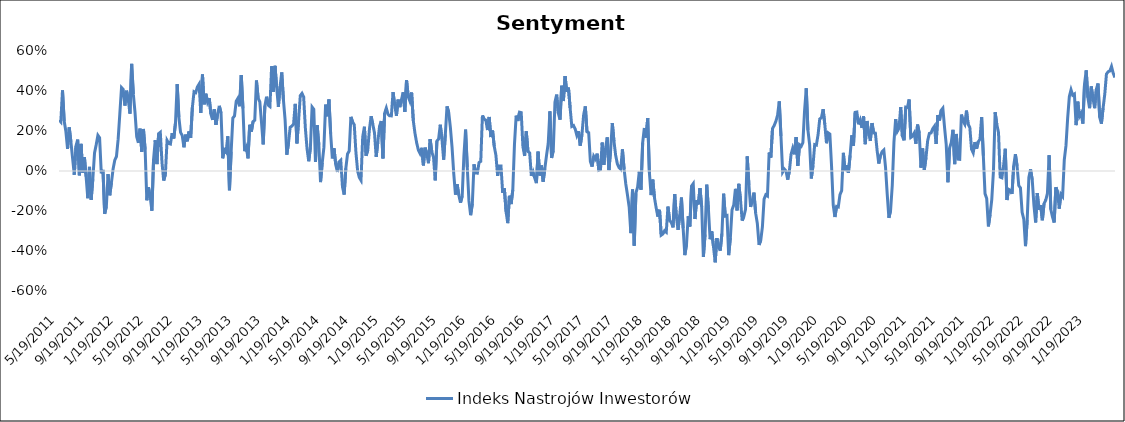
| Category | Indeks Nastrojów Inwestorów |
|---|---|
| 5/19/11 | 0.255 |
| 5/26/11 | 0.245 |
| 6/2/11 | 0.403 |
| 6/9/11 | 0.25 |
| 6/16/11 | 0.199 |
| 6/23/11 | 0.11 |
| 6/30/11 | 0.218 |
| 7/7/11 | 0.145 |
| 7/14/11 | 0.063 |
| 7/21/11 | -0.019 |
| 7/28/11 | 0.125 |
| 8/4/11 | 0.157 |
| 8/11/11 | -0.022 |
| 8/18/11 | 0.136 |
| 8/25/11 | -0.008 |
| 9/1/11 | 0.07 |
| 9/8/11 | -0.028 |
| 9/15/11 | -0.136 |
| 9/22/11 | 0.02 |
| 9/29/11 | -0.144 |
| 10/6/11 | -0.038 |
| 10/13/11 | 0.09 |
| 10/20/11 | 0.132 |
| 10/27/11 | 0.179 |
| 11/3/11 | 0.167 |
| 11/10/11 | -0.012 |
| 11/17/11 | 0.005 |
| 11/24/11 | -0.214 |
| 12/1/11 | -0.177 |
| 12/8/11 | -0.016 |
| 12/15/11 | -0.121 |
| 12/22/11 | -0.06 |
| 12/29/11 | 0.01 |
| 1/5/12 | 0.054 |
| 1/12/12 | 0.073 |
| 1/19/12 | 0.159 |
| 1/26/12 | 0.287 |
| 2/2/12 | 0.417 |
| 2/9/12 | 0.408 |
| 2/16/12 | 0.327 |
| 2/23/12 | 0.402 |
| 3/1/12 | 0.357 |
| 3/8/12 | 0.287 |
| 3/15/12 | 0.536 |
| 3/22/12 | 0.384 |
| 3/29/12 | 0.294 |
| 4/5/12 | 0.172 |
| 4/12/12 | 0.141 |
| 4/19/12 | 0.212 |
| 4/26/12 | 0.096 |
| 5/3/12 | 0.21 |
| 5/10/12 | 0.107 |
| 5/17/12 | -0.146 |
| 5/24/12 | -0.081 |
| 5/31/12 | -0.128 |
| 6/7/12 | -0.198 |
| 6/14/12 | 0.058 |
| 6/21/12 | 0.154 |
| 6/28/12 | 0.034 |
| 7/5/12 | 0.187 |
| 7/12/12 | 0.193 |
| 7/19/12 | 0.042 |
| 7/26/12 | -0.048 |
| 8/2/12 | -0.017 |
| 8/9/12 | 0.153 |
| 8/16/12 | 0.138 |
| 8/23/12 | 0.135 |
| 8/30/12 | 0.189 |
| 9/6/12 | 0.163 |
| 9/13/12 | 0.241 |
| 9/20/12 | 0.434 |
| 9/27/12 | 0.27 |
| 10/4/12 | 0.193 |
| 10/11/12 | 0.177 |
| 10/18/12 | 0.119 |
| 10/25/12 | 0.182 |
| 11/1/12 | 0.148 |
| 11/8/12 | 0.198 |
| 11/15/12 | 0.166 |
| 11/22/12 | 0.317 |
| 11/29/12 | 0.396 |
| 12/6/12 | 0.392 |
| 12/13/12 | 0.421 |
| 12/20/12 | 0.435 |
| 12/27/12 | 0.29 |
| 1/3/13 | 0.482 |
| 1/10/13 | 0.333 |
| 1/17/13 | 0.386 |
| 1/24/13 | 0.344 |
| 1/31/13 | 0.365 |
| 2/7/13 | 0.285 |
| 2/14/13 | 0.256 |
| 2/21/13 | 0.308 |
| 2/28/13 | 0.231 |
| 3/7/13 | 0.285 |
| 3/14/13 | 0.326 |
| 3/21/13 | 0.29 |
| 3/28/13 | 0.063 |
| 4/4/13 | 0.105 |
| 4/11/13 | 0.094 |
| 4/18/13 | 0.174 |
| 4/25/13 | -0.096 |
| 5/2/13 | 0.097 |
| 5/9/13 | 0.264 |
| 5/16/13 | 0.276 |
| 5/23/13 | 0.349 |
| 5/30/13 | 0.364 |
| 6/6/13 | 0.324 |
| 6/13/13 | 0.48 |
| 6/20/13 | 0.313 |
| 6/27/13 | 0.099 |
| 7/4/13 | 0.118 |
| 7/11/13 | 0.063 |
| 7/18/13 | 0.231 |
| 7/25/13 | 0.197 |
| 8/1/13 | 0.247 |
| 8/8/13 | 0.254 |
| 8/15/13 | 0.453 |
| 8/22/13 | 0.364 |
| 8/29/13 | 0.346 |
| 9/5/13 | 0.243 |
| 9/12/13 | 0.133 |
| 9/19/13 | 0.326 |
| 9/26/13 | 0.371 |
| 10/3/13 | 0.329 |
| 10/10/13 | 0.322 |
| 10/17/13 | 0.523 |
| 10/24/13 | 0.396 |
| 10/31/13 | 0.526 |
| 11/7/13 | 0.418 |
| 11/14/13 | 0.321 |
| 11/21/13 | 0.422 |
| 11/28/13 | 0.493 |
| 12/5/13 | 0.355 |
| 12/12/13 | 0.255 |
| 12/19/13 | 0.081 |
| 12/26/13 | 0.14 |
| 1/2/14 | 0.219 |
| 1/9/14 | 0.224 |
| 1/16/14 | 0.234 |
| 1/23/14 | 0.336 |
| 1/30/14 | 0.138 |
| 2/6/14 | 0.253 |
| 2/13/14 | 0.377 |
| 2/20/14 | 0.388 |
| 2/27/14 | 0.37 |
| 3/6/14 | 0.215 |
| 3/13/14 | 0.112 |
| 3/20/14 | 0.049 |
| 3/27/14 | 0.118 |
| 4/3/14 | 0.32 |
| 4/10/14 | 0.309 |
| 4/17/14 | 0.045 |
| 4/24/14 | 0.229 |
| 5/1/14 | 0.131 |
| 5/8/14 | -0.055 |
| 5/15/14 | 0.04 |
| 5/22/14 | 0.118 |
| 5/29/14 | 0.332 |
| 6/5/14 | 0.273 |
| 6/12/14 | 0.358 |
| 6/19/14 | 0.186 |
| 6/26/14 | 0.063 |
| 7/3/14 | 0.114 |
| 7/10/14 | 0.033 |
| 7/17/14 | -0.005 |
| 7/24/14 | 0.046 |
| 7/31/14 | 0.054 |
| 8/7/14 | -0.079 |
| 8/14/14 | -0.118 |
| 8/21/14 | 0.013 |
| 8/28/14 | 0.085 |
| 9/4/14 | 0.1 |
| 9/11/14 | 0.271 |
| 9/18/14 | 0.245 |
| 9/25/14 | 0.231 |
| 10/2/14 | 0.092 |
| 10/9/14 | 0 |
| 10/16/14 | -0.033 |
| 10/23/14 | -0.047 |
| 10/30/14 | 0.169 |
| 11/6/14 | 0.221 |
| 11/13/14 | 0.076 |
| 11/20/14 | 0.104 |
| 11/27/14 | 0.209 |
| 12/4/14 | 0.274 |
| 12/11/14 | 0.233 |
| 12/18/14 | 0.19 |
| 12/25/14 | 0.07 |
| 1/1/15 | 0.147 |
| 1/8/15 | 0.224 |
| 1/15/15 | 0.25 |
| 1/22/15 | 0.063 |
| 1/29/15 | 0.289 |
| 2/5/15 | 0.315 |
| 2/12/15 | 0.284 |
| 2/19/15 | 0.276 |
| 2/26/15 | 0.276 |
| 3/5/15 | 0.394 |
| 3/12/15 | 0.329 |
| 3/19/15 | 0.276 |
| 3/26/15 | 0.357 |
| 4/2/15 | 0.319 |
| 4/9/15 | 0.357 |
| 4/16/15 | 0.394 |
| 4/23/15 | 0.295 |
| 4/30/15 | 0.454 |
| 5/7/15 | 0.372 |
| 5/14/15 | 0.349 |
| 5/21/15 | 0.393 |
| 5/28/15 | 0.252 |
| 6/4/15 | 0.188 |
| 6/11/15 | 0.141 |
| 6/18/15 | 0.105 |
| 6/25/15 | 0.088 |
| 7/2/15 | 0.116 |
| 7/9/15 | 0.028 |
| 7/16/15 | 0.117 |
| 7/23/15 | 0.087 |
| 7/30/15 | 0.039 |
| 8/6/15 | 0.159 |
| 8/13/15 | 0.095 |
| 8/20/15 | 0.068 |
| 8/27/15 | -0.047 |
| 9/3/15 | 0.15 |
| 9/10/15 | 0.16 |
| 9/17/15 | 0.231 |
| 9/24/15 | 0.159 |
| 10/1/15 | 0.057 |
| 10/8/15 | 0.183 |
| 10/15/15 | 0.323 |
| 10/22/15 | 0.294 |
| 10/29/15 | 0.217 |
| 11/5/15 | 0.116 |
| 11/12/15 | -0.015 |
| 11/19/15 | -0.118 |
| 11/26/15 | -0.066 |
| 12/3/15 | -0.12 |
| 12/10/15 | -0.159 |
| 12/17/15 | -0.125 |
| 12/24/15 | 0.074 |
| 12/31/15 | 0.207 |
| 1/7/16 | 0.02 |
| 1/14/16 | -0.149 |
| 1/21/16 | -0.221 |
| 1/28/16 | -0.164 |
| 2/4/16 | 0.033 |
| 2/11/16 | -0.01 |
| 2/18/16 | -0.011 |
| 2/25/16 | 0.043 |
| 3/3/16 | 0.048 |
| 3/10/16 | 0.278 |
| 3/17/16 | 0.259 |
| 3/24/16 | 0.255 |
| 3/31/16 | 0.205 |
| 4/7/16 | 0.27 |
| 4/14/16 | 0.17 |
| 4/21/16 | 0.203 |
| 4/28/16 | 0.124 |
| 5/5/16 | 0.078 |
| 5/12/16 | -0.024 |
| 5/19/16 | 0.025 |
| 5/26/16 | 0.025 |
| 6/2/16 | -0.109 |
| 6/9/16 | -0.087 |
| 6/16/16 | -0.202 |
| 6/23/16 | -0.261 |
| 6/30/16 | -0.124 |
| 7/7/16 | -0.165 |
| 7/14/16 | -0.094 |
| 7/21/16 | 0.135 |
| 7/28/16 | 0.277 |
| 8/4/16 | 0.25 |
| 8/11/16 | 0.294 |
| 8/18/16 | 0.292 |
| 8/25/16 | 0.122 |
| 9/1/16 | 0.075 |
| 9/8/16 | 0.198 |
| 9/15/16 | 0.098 |
| 9/22/16 | 0.09 |
| 9/29/16 | -0.024 |
| 10/6/16 | -0.004 |
| 10/13/16 | -0.035 |
| 10/20/16 | -0.06 |
| 10/27/16 | 0.097 |
| 11/3/16 | -0.023 |
| 11/10/16 | 0.028 |
| 11/17/16 | -0.054 |
| 11/24/16 | 0.013 |
| 12/1/16 | 0.078 |
| 12/8/16 | 0.137 |
| 12/15/16 | 0.298 |
| 12/22/16 | 0.065 |
| 12/29/16 | 0.102 |
| 1/5/17 | 0.344 |
| 1/12/17 | 0.382 |
| 1/19/17 | 0.289 |
| 1/26/17 | 0.257 |
| 2/2/17 | 0.426 |
| 2/9/17 | 0.35 |
| 2/16/17 | 0.475 |
| 2/23/17 | 0.396 |
| 3/2/17 | 0.417 |
| 3/9/17 | 0.315 |
| 3/16/17 | 0.223 |
| 3/23/17 | 0.228 |
| 3/30/17 | 0.21 |
| 4/6/17 | 0.178 |
| 4/13/17 | 0.199 |
| 4/20/17 | 0.127 |
| 4/27/17 | 0.182 |
| 5/4/17 | 0.28 |
| 5/11/17 | 0.323 |
| 5/18/17 | 0.196 |
| 5/25/17 | 0.191 |
| 6/1/17 | 0.047 |
| 6/8/17 | 0.022 |
| 6/15/17 | 0.074 |
| 6/22/17 | 0.06 |
| 6/29/17 | 0.087 |
| 7/6/17 | 0.004 |
| 7/13/17 | 0.007 |
| 7/20/17 | 0.142 |
| 7/27/17 | 0.031 |
| 8/3/17 | 0.114 |
| 8/10/17 | 0.168 |
| 8/17/17 | 0.005 |
| 8/24/17 | 0.102 |
| 8/31/17 | 0.24 |
| 9/7/17 | 0.148 |
| 9/14/17 | 0.078 |
| 9/21/17 | 0.036 |
| 9/28/17 | 0.017 |
| 10/5/17 | 0.008 |
| 10/12/17 | 0.108 |
| 10/19/17 | 0.009 |
| 10/26/17 | -0.065 |
| 11/2/17 | -0.12 |
| 11/9/17 | -0.18 |
| 11/16/17 | -0.311 |
| 11/23/17 | -0.093 |
| 11/30/17 | -0.373 |
| 12/7/17 | -0.11 |
| 12/14/17 | -0.081 |
| 12/21/17 | -0.004 |
| 12/28/17 | -0.093 |
| 1/4/18 | 0.141 |
| 1/11/18 | 0.215 |
| 1/18/18 | 0.167 |
| 1/25/18 | 0.264 |
| 2/1/18 | -0.009 |
| 2/8/18 | -0.12 |
| 2/15/18 | -0.043 |
| 2/22/18 | -0.133 |
| 3/1/18 | -0.184 |
| 3/8/18 | -0.228 |
| 3/15/18 | -0.194 |
| 3/22/18 | -0.321 |
| 3/29/18 | -0.315 |
| 4/5/18 | -0.299 |
| 4/12/18 | -0.306 |
| 4/19/18 | -0.178 |
| 4/26/18 | -0.248 |
| 5/3/18 | -0.258 |
| 5/10/18 | -0.282 |
| 5/17/18 | -0.116 |
| 5/24/18 | -0.23 |
| 5/31/18 | -0.295 |
| 6/7/18 | -0.22 |
| 6/14/18 | -0.133 |
| 6/21/18 | -0.286 |
| 6/28/18 | -0.421 |
| 7/5/18 | -0.368 |
| 7/12/18 | -0.226 |
| 7/19/18 | -0.278 |
| 7/26/18 | -0.075 |
| 8/2/18 | -0.063 |
| 8/9/18 | -0.24 |
| 8/16/18 | -0.147 |
| 8/23/18 | -0.167 |
| 8/30/18 | -0.086 |
| 9/6/18 | -0.178 |
| 9/13/18 | -0.43 |
| 9/20/18 | -0.317 |
| 9/27/18 | -0.068 |
| 10/4/18 | -0.192 |
| 10/11/18 | -0.341 |
| 10/18/18 | -0.302 |
| 10/25/18 | -0.379 |
| 11/1/18 | -0.457 |
| 11/8/18 | -0.336 |
| 11/15/18 | -0.378 |
| 11/22/18 | -0.398 |
| 11/29/18 | -0.313 |
| 12/6/18 | -0.113 |
| 12/13/18 | -0.225 |
| 12/20/18 | -0.223 |
| 12/27/18 | -0.421 |
| 1/3/19 | -0.335 |
| 1/10/19 | -0.194 |
| 1/17/19 | -0.17 |
| 1/24/19 | -0.089 |
| 1/31/19 | -0.197 |
| 2/7/19 | -0.064 |
| 2/14/19 | -0.142 |
| 2/21/19 | -0.248 |
| 2/28/19 | -0.228 |
| 3/7/19 | -0.191 |
| 3/14/19 | 0.073 |
| 3/21/19 | -0.069 |
| 3/28/19 | -0.18 |
| 4/4/19 | -0.147 |
| 4/11/19 | -0.108 |
| 4/18/19 | -0.211 |
| 4/25/19 | -0.263 |
| 5/2/19 | -0.369 |
| 5/9/19 | -0.348 |
| 5/16/19 | -0.28 |
| 5/23/19 | -0.141 |
| 5/30/19 | -0.119 |
| 6/6/19 | -0.125 |
| 6/13/19 | 0.092 |
| 6/20/19 | 0.067 |
| 6/27/19 | 0.212 |
| 7/4/19 | 0.228 |
| 7/11/19 | 0.249 |
| 7/18/19 | 0.279 |
| 7/25/19 | 0.348 |
| 8/1/19 | 0.175 |
| 8/8/19 | -0.005 |
| 8/15/19 | 0.009 |
| 8/22/19 | 0 |
| 8/29/19 | -0.043 |
| 9/5/19 | 0 |
| 9/12/19 | 0.083 |
| 9/19/19 | 0.114 |
| 9/26/19 | 0.083 |
| 10/3/19 | 0.169 |
| 10/10/19 | 0.026 |
| 10/17/19 | 0.131 |
| 10/24/19 | 0.124 |
| 10/31/19 | 0.142 |
| 11/7/19 | 0.301 |
| 11/14/19 | 0.414 |
| 11/21/19 | 0.205 |
| 11/28/19 | 0.132 |
| 12/5/19 | -0.037 |
| 12/12/19 | 0.027 |
| 12/19/19 | 0.132 |
| 12/26/19 | 0.129 |
| 1/2/20 | 0.181 |
| 1/9/20 | 0.26 |
| 1/16/20 | 0.266 |
| 1/23/20 | 0.309 |
| 1/30/20 | 0.234 |
| 2/6/20 | 0.139 |
| 2/13/20 | 0.191 |
| 2/20/20 | 0.185 |
| 2/27/20 | 0.026 |
| 3/5/20 | -0.17 |
| 3/12/20 | -0.23 |
| 3/19/20 | -0.177 |
| 3/26/20 | -0.18 |
| 4/2/20 | -0.118 |
| 4/9/20 | -0.098 |
| 4/16/20 | 0.091 |
| 4/23/20 | 0 |
| 4/30/20 | 0.029 |
| 5/7/20 | -0.009 |
| 5/14/20 | 0.078 |
| 5/21/20 | 0.179 |
| 5/28/20 | 0.127 |
| 6/4/20 | 0.293 |
| 6/11/20 | 0.295 |
| 6/18/20 | 0.233 |
| 6/25/20 | 0.255 |
| 7/2/20 | 0.216 |
| 7/9/20 | 0.273 |
| 7/16/20 | 0.134 |
| 7/23/20 | 0.25 |
| 7/30/20 | 0.189 |
| 8/6/20 | 0.15 |
| 8/13/20 | 0.24 |
| 8/20/20 | 0.19 |
| 8/27/20 | 0.189 |
| 9/3/20 | 0.104 |
| 9/10/20 | 0.037 |
| 9/17/20 | 0.077 |
| 9/24/20 | 0.097 |
| 10/1/20 | 0.105 |
| 10/8/20 | 0.02 |
| 10/15/20 | -0.114 |
| 10/22/20 | -0.234 |
| 10/29/20 | -0.198 |
| 11/5/20 | -0.072 |
| 11/12/20 | 0.144 |
| 11/19/20 | 0.259 |
| 11/26/20 | 0.198 |
| 12/3/20 | 0.213 |
| 12/10/20 | 0.319 |
| 12/17/20 | 0.175 |
| 12/24/20 | 0.153 |
| 12/31/20 | 0.32 |
| 1/7/21 | 0.318 |
| 1/14/21 | 0.358 |
| 1/21/21 | 0.168 |
| 1/28/21 | 0.174 |
| 2/4/21 | 0.189 |
| 2/11/21 | 0.136 |
| 2/18/21 | 0.232 |
| 2/25/21 | 0.19 |
| 3/4/21 | 0.017 |
| 3/11/21 | 0.113 |
| 3/18/21 | 0.006 |
| 3/25/21 | 0.067 |
| 4/1/21 | 0.152 |
| 4/8/21 | 0.188 |
| 4/15/21 | 0.19 |
| 4/22/21 | 0.211 |
| 4/29/21 | 0.224 |
| 5/6/21 | 0.135 |
| 5/13/21 | 0.28 |
| 5/20/21 | 0.253 |
| 5/27/21 | 0.303 |
| 6/3/21 | 0.314 |
| 6/10/21 | 0.219 |
| 6/17/21 | 0.132 |
| 6/24/21 | -0.056 |
| 7/1/21 | 0.115 |
| 7/8/21 | 0.143 |
| 7/15/21 | 0.206 |
| 7/22/21 | 0.035 |
| 7/29/21 | 0.185 |
| 8/5/21 | 0.059 |
| 8/12/21 | 0.058 |
| 8/19/21 | 0.282 |
| 8/26/21 | 0.248 |
| 9/2/21 | 0.234 |
| 9/9/21 | 0.302 |
| 9/16/21 | 0.234 |
| 9/23/21 | 0.217 |
| 9/30/21 | 0.109 |
| 10/7/21 | 0.091 |
| 10/14/21 | 0.145 |
| 10/21/21 | 0.111 |
| 10/28/21 | 0.146 |
| 11/4/21 | 0.159 |
| 11/11/21 | 0.27 |
| 11/18/21 | 0.076 |
| 11/25/21 | -0.113 |
| 12/2/21 | -0.138 |
| 12/9/21 | -0.277 |
| 12/16/21 | -0.218 |
| 12/23/21 | -0.143 |
| 12/30/21 | 0 |
| 1/6/22 | 0.294 |
| 1/13/22 | 0.233 |
| 1/20/22 | 0.192 |
| 1/27/22 | -0.03 |
| 2/3/22 | -0.034 |
| 2/10/22 | 0.026 |
| 2/17/22 | 0.111 |
| 2/24/22 | -0.145 |
| 3/3/22 | -0.092 |
| 3/10/22 | -0.097 |
| 3/17/22 | -0.115 |
| 3/24/22 | 0.026 |
| 3/31/22 | 0.084 |
| 4/7/22 | 0.026 |
| 4/14/22 | -0.073 |
| 4/21/22 | -0.084 |
| 4/28/22 | -0.206 |
| 5/5/22 | -0.241 |
| 5/12/22 | -0.376 |
| 5/19/22 | -0.246 |
| 5/26/22 | -0.033 |
| 6/2/22 | 0.008 |
| 6/9/22 | -0.044 |
| 6/16/22 | -0.17 |
| 6/23/22 | -0.257 |
| 6/30/22 | -0.11 |
| 7/7/22 | -0.194 |
| 7/14/22 | -0.17 |
| 7/21/22 | -0.246 |
| 7/28/22 | -0.163 |
| 8/4/22 | -0.146 |
| 8/11/22 | -0.112 |
| 8/18/22 | 0.079 |
| 8/25/22 | -0.192 |
| 9/1/22 | -0.229 |
| 9/8/22 | -0.257 |
| 9/15/22 | -0.081 |
| 9/22/22 | -0.105 |
| 9/29/22 | -0.188 |
| 10/6/22 | -0.116 |
| 10/13/22 | -0.128 |
| 10/20/22 | 0.056 |
| 10/27/22 | 0.127 |
| 11/3/22 | 0.265 |
| 11/10/22 | 0.372 |
| 11/17/22 | 0.406 |
| 11/24/22 | 0.379 |
| 12/1/22 | 0.385 |
| 12/8/22 | 0.229 |
| 12/15/22 | 0.347 |
| 12/22/22 | 0.273 |
| 12/29/22 | 0.288 |
| 1/5/23 | 0.237 |
| 1/12/23 | 0.434 |
| 1/19/23 | 0.503 |
| 1/26/23 | 0.367 |
| 2/2/23 | 0.314 |
| 2/9/23 | 0.423 |
| 2/16/23 | 0.364 |
| 2/23/23 | 0.314 |
| 3/2/23 | 0.409 |
| 3/9/23 | 0.438 |
| 3/16/23 | 0.268 |
| 3/23/23 | 0.236 |
| 3/30/23 | 0.314 |
| 4/6/23 | 0.384 |
| 4/13/23 | 0.485 |
| 4/20/23 | 0.496 |
| 4/27/23 | 0.5 |
| 5/4/23 | 0.523 |
| 5/11/23 | 0.489 |
| 5/18/23 | 0.467 |